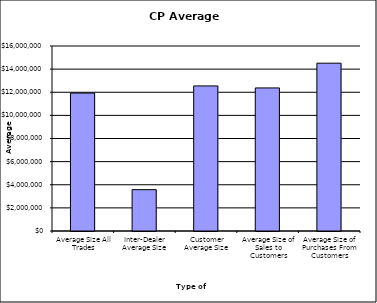
| Category | Security Type |
|---|---|
| Average Size All Trades | 11928800.475 |
| Inter-Dealer Average Size | 3576781.609 |
| Customer Average Size | 12546679.422 |
| Average Size of Sales to Customers | 12373761.332 |
| Average Size of Purchases From Customers | 14514305.263 |